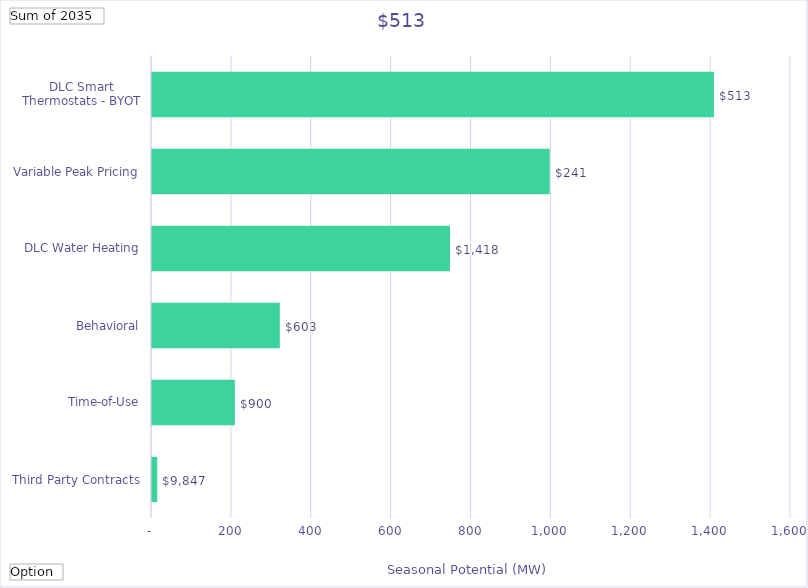
| Category | Winter Peak Reduction @Meter  (Therms) |
|---|---|
| Third Party Contracts | 13.117 |
| Time-of-Use | 207.44 |
| Behavioral | 320.108 |
| DLC Water Heating | 746.114 |
| Variable Peak Pricing | 995.62 |
| DLC Smart Thermostats - BYOT | 1407.059 |